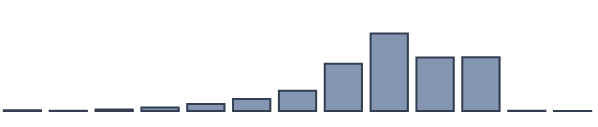
| Category | Series 0 |
|---|---|
| 0 | 0.236 |
| 1 | 0.098 |
| 2 | 0.5 |
| 3 | 1.243 |
| 4 | 2.503 |
| 5 | 4.339 |
| 6 | 7.333 |
| 7 | 17.067 |
| 8 | 27.957 |
| 9 | 19.254 |
| 10 | 19.382 |
| 11 | 0.055 |
| 12 | 0.032 |